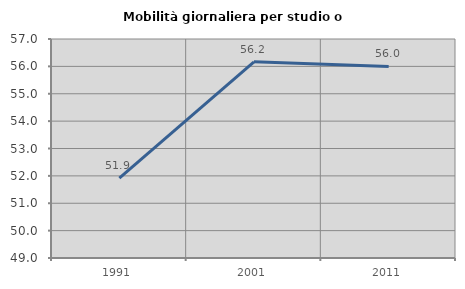
| Category | Mobilità giornaliera per studio o lavoro |
|---|---|
| 1991.0 | 51.915 |
| 2001.0 | 56.167 |
| 2011.0 | 55.997 |